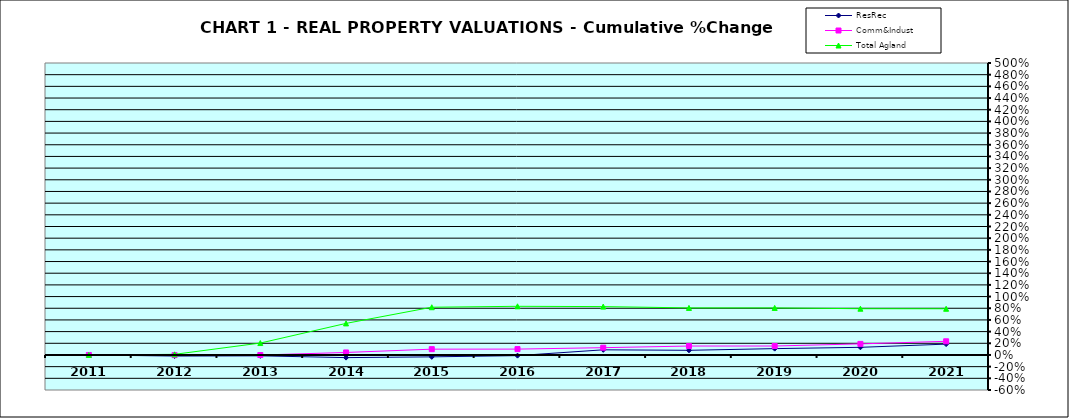
| Category | ResRec | Comm&Indust | Total Agland |
|---|---|---|---|
| 2011.0 | 0 | 0 | 0 |
| 2012.0 | -0.019 | -0.003 | 0.011 |
| 2013.0 | -0.015 | -0.001 | 0.204 |
| 2014.0 | -0.046 | 0.043 | 0.541 |
| 2015.0 | -0.032 | 0.099 | 0.818 |
| 2016.0 | -0.011 | 0.1 | 0.833 |
| 2017.0 | 0.088 | 0.125 | 0.828 |
| 2018.0 | 0.08 | 0.153 | 0.806 |
| 2019.0 | 0.109 | 0.153 | 0.806 |
| 2020.0 | 0.131 | 0.19 | 0.792 |
| 2021.0 | 0.186 | 0.234 | 0.791 |